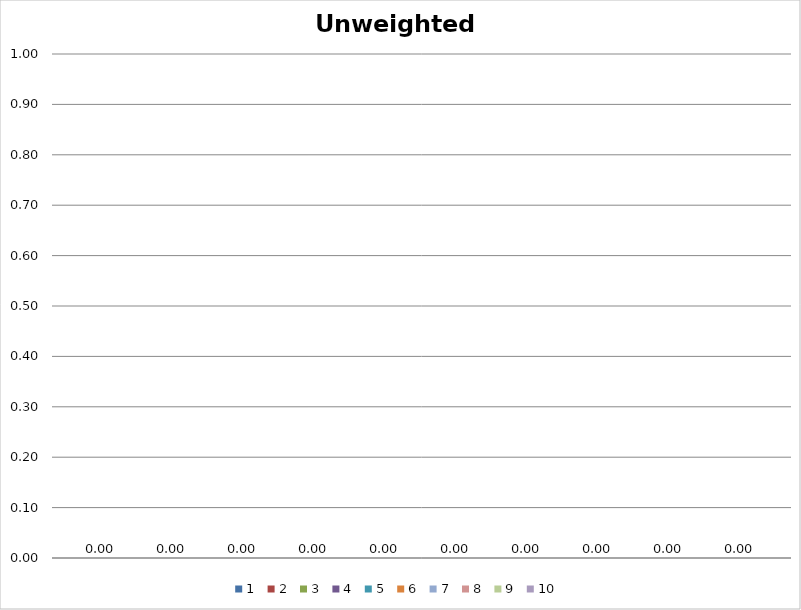
| Category | Series 0 | Series 1 | Series 2 | Series 3 | Series 4 | Series 5 | Series 6 | Series 7 | Series 8 | Series 9 |
|---|---|---|---|---|---|---|---|---|---|---|
| 0 | 0 | 0 | 0 | 0 | 0 | 0 | 0 | 0 | 0 | 0 |